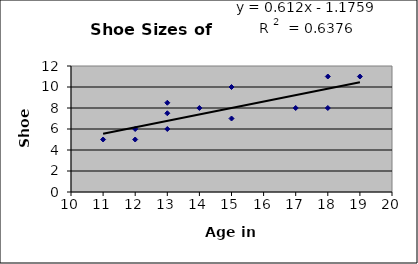
| Category |  Shoe Size (Y) |
|---|---|
| 11.0 | 5 |
| 12.0 | 6 |
| 12.0 | 5 |
| 13.0 | 7.5 |
| 13.0 | 6 |
| 13.0 | 8.5 |
| 14.0 | 8 |
| 15.0 | 10 |
| 15.0 | 7 |
| 17.0 | 8 |
| 18.0 | 11 |
| 18.0 | 8 |
| 19.0 | 11 |